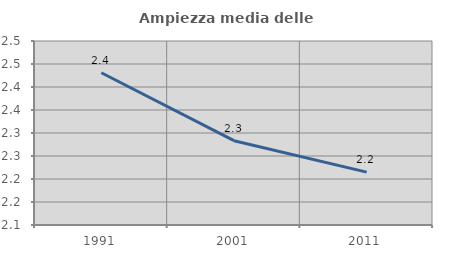
| Category | Ampiezza media delle famiglie |
|---|---|
| 1991.0 | 2.431 |
| 2001.0 | 2.283 |
| 2011.0 | 2.215 |